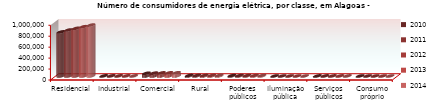
| Category | 2010 | 2011 | 2012 | 2013 | 2014 |
|---|---|---|---|---|---|
| Residencial | 805236 | 840275 | 870668 | 900642 | 930441 |
| Industrial | 2642 | 2677 | 2671 | 2649 | 2593 |
| Comercial | 50305 | 52179 | 56367 | 57689 | 59163 |
| Rural | 9908 | 10033 | 10326 | 10429 | 11595 |
| Poderes públicos | 7928 | 8285 | 8345 | 8581 | 8673 |
| Iluminação pública | 163 | 194 | 200 | 197 | 203 |
| Serviços públicos | 1074 | 1050 | 1092 | 1139 | 1199 |
| Consumo próprio | 136 | 150 | 153 | 128 | 104 |